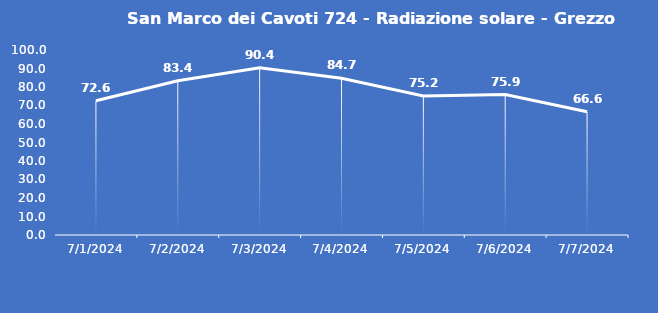
| Category | San Marco dei Cavoti 724 - Radiazione solare - Grezzo (W/m2) |
|---|---|
| 7/1/24 | 72.6 |
| 7/2/24 | 83.4 |
| 7/3/24 | 90.4 |
| 7/4/24 | 84.7 |
| 7/5/24 | 75.2 |
| 7/6/24 | 75.9 |
| 7/7/24 | 66.6 |